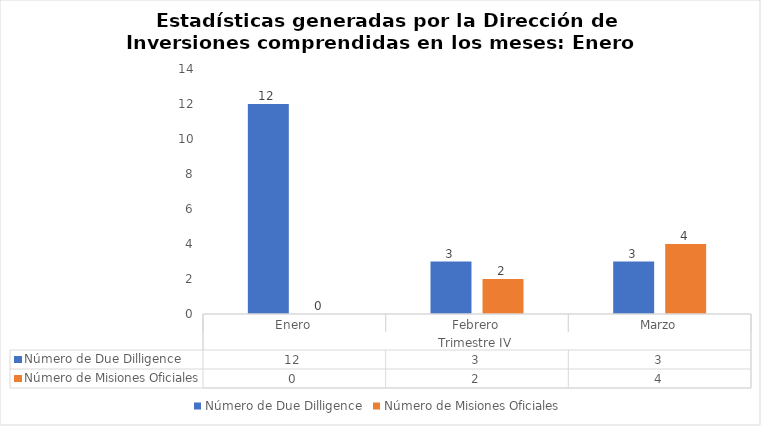
| Category | Número de Due Dilligence | Número de Misiones Oficiales |
|---|---|---|
| 0 | 12 | 0 |
| 1 | 3 | 2 |
| 2 | 3 | 4 |